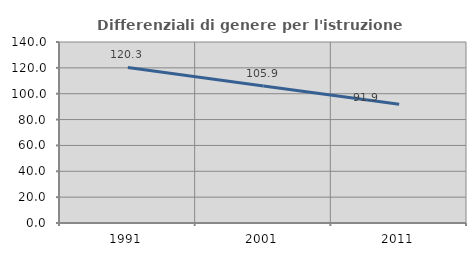
| Category | Differenziali di genere per l'istruzione superiore |
|---|---|
| 1991.0 | 120.288 |
| 2001.0 | 105.936 |
| 2011.0 | 91.931 |